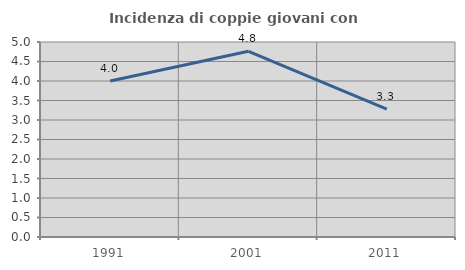
| Category | Incidenza di coppie giovani con figli |
|---|---|
| 1991.0 | 4 |
| 2001.0 | 4.762 |
| 2011.0 | 3.279 |